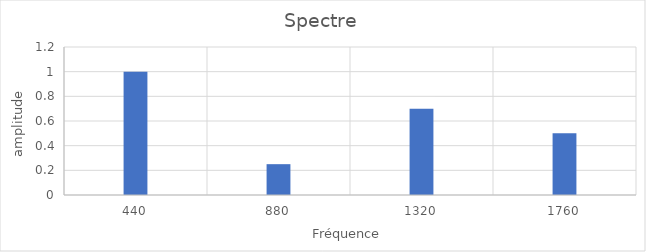
| Category | Series 0 |
|---|---|
| 440.0 | 1 |
| 880.0 | 0.25 |
| 1320.0 | 0.7 |
| 1760.0 | 0.5 |